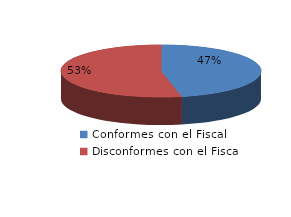
| Category | Series 0 |
|---|---|
| 0 | 424 |
| 1 | 484 |